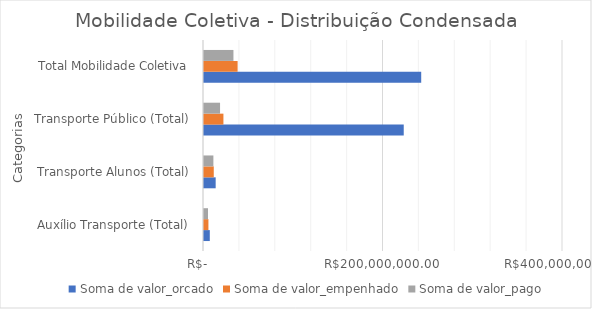
| Category | Soma de valor_orcado | Soma de valor_empenhado | Soma de valor_pago |
|---|---|---|---|
| Auxílio Transporte (Total) | 6460308 | 4925803.91 | 4472854.57 |
| Transporte Alunos (Total) | 13002548 | 10886351.6 | 10453789.2 |
| Transporte Público (Total) | 222551257 | 21640361.15 | 17880411.94 |
| Total Mobilidade Coletiva | 242014113 | 37452516.66 | 32807055.71 |